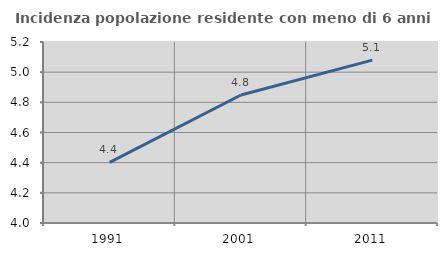
| Category | Incidenza popolazione residente con meno di 6 anni |
|---|---|
| 1991.0 | 4.402 |
| 2001.0 | 4.849 |
| 2011.0 | 5.08 |